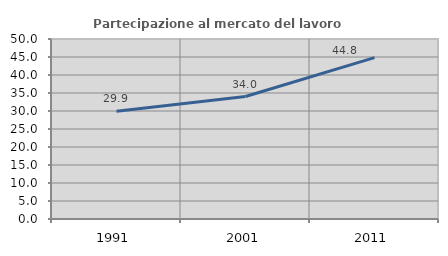
| Category | Partecipazione al mercato del lavoro  femminile |
|---|---|
| 1991.0 | 29.942 |
| 2001.0 | 34.015 |
| 2011.0 | 44.836 |